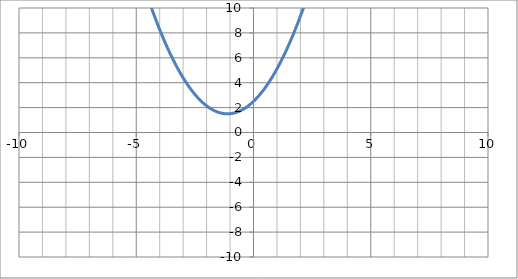
| Category | f(x) |
|---|---|
| -10.0 | 65.5 |
| -9.9 | 64.068 |
| -9.8 | 62.652 |
| -9.700000000000001 | 61.253 |
| -9.600000000000001 | 59.87 |
| -9.500000000000002 | 58.503 |
| -9.400000000000002 | 57.152 |
| -9.300000000000002 | 55.817 |
| -9.200000000000003 | 54.498 |
| -9.100000000000003 | 53.196 |
| -9.000000000000004 | 51.91 |
| -8.900000000000004 | 50.64 |
| -8.800000000000004 | 49.386 |
| -8.700000000000005 | 48.149 |
| -8.600000000000005 | 46.928 |
| -8.500000000000005 | 45.723 |
| -8.400000000000006 | 44.534 |
| -8.300000000000006 | 43.361 |
| -8.200000000000006 | 42.204 |
| -8.100000000000007 | 41.064 |
| -8.000000000000007 | 39.94 |
| -7.9000000000000075 | 38.832 |
| -7.800000000000008 | 37.74 |
| -7.700000000000008 | 36.665 |
| -7.6000000000000085 | 35.606 |
| -7.500000000000009 | 34.563 |
| -7.400000000000009 | 33.536 |
| -7.30000000000001 | 32.525 |
| -7.20000000000001 | 31.53 |
| -7.10000000000001 | 30.552 |
| -7.000000000000011 | 29.59 |
| -6.900000000000011 | 28.644 |
| -6.800000000000011 | 27.714 |
| -6.700000000000012 | 26.801 |
| -6.600000000000012 | 25.904 |
| -6.500000000000012 | 25.023 |
| -6.400000000000013 | 24.158 |
| -6.300000000000013 | 23.309 |
| -6.2000000000000135 | 22.476 |
| -6.100000000000014 | 21.66 |
| -6.000000000000014 | 20.86 |
| -5.900000000000015 | 20.076 |
| -5.800000000000015 | 19.308 |
| -5.700000000000015 | 18.557 |
| -5.600000000000016 | 17.822 |
| -5.500000000000016 | 17.103 |
| -5.400000000000016 | 16.4 |
| -5.300000000000017 | 15.713 |
| -5.200000000000017 | 15.042 |
| -5.100000000000017 | 14.388 |
| -5.000000000000018 | 13.75 |
| -4.900000000000018 | 13.128 |
| -4.8000000000000185 | 12.522 |
| -4.700000000000019 | 11.933 |
| -4.600000000000019 | 11.36 |
| -4.5000000000000195 | 10.803 |
| -4.40000000000002 | 10.262 |
| -4.30000000000002 | 9.737 |
| -4.200000000000021 | 9.228 |
| -4.100000000000021 | 8.736 |
| -4.000000000000021 | 8.26 |
| -3.9000000000000212 | 7.8 |
| -3.800000000000021 | 7.356 |
| -3.700000000000021 | 6.929 |
| -3.600000000000021 | 6.518 |
| -3.500000000000021 | 6.123 |
| -3.400000000000021 | 5.744 |
| -3.3000000000000207 | 5.381 |
| -3.2000000000000206 | 5.034 |
| -3.1000000000000205 | 4.704 |
| -3.0000000000000204 | 4.39 |
| -2.9000000000000203 | 4.092 |
| -2.8000000000000203 | 3.81 |
| -2.70000000000002 | 3.545 |
| -2.60000000000002 | 3.296 |
| -2.50000000000002 | 3.063 |
| -2.40000000000002 | 2.846 |
| -2.30000000000002 | 2.645 |
| -2.2000000000000197 | 2.46 |
| -2.1000000000000196 | 2.292 |
| -2.0000000000000195 | 2.14 |
| -1.9000000000000195 | 2.004 |
| -1.8000000000000194 | 1.884 |
| -1.7000000000000193 | 1.781 |
| -1.6000000000000192 | 1.694 |
| -1.500000000000019 | 1.623 |
| -1.400000000000019 | 1.568 |
| -1.300000000000019 | 1.529 |
| -1.2000000000000188 | 1.506 |
| -1.1000000000000187 | 1.5 |
| -1.0000000000000187 | 1.51 |
| -0.9000000000000187 | 1.536 |
| -0.8000000000000187 | 1.578 |
| -0.7000000000000187 | 1.637 |
| -0.6000000000000187 | 1.712 |
| -0.5000000000000188 | 1.802 |
| -0.4000000000000188 | 1.91 |
| -0.3000000000000188 | 2.033 |
| -0.2000000000000188 | 2.172 |
| -0.1000000000000188 | 2.328 |
| -1.8790524691780774e-14 | 2.5 |
| 0.09999999999998122 | 2.688 |
| 0.19999999999998122 | 2.892 |
| 0.2999999999999812 | 3.113 |
| 0.39999999999998126 | 3.35 |
| 0.49999999999998124 | 3.602 |
| 0.5999999999999812 | 3.872 |
| 0.6999999999999812 | 4.157 |
| 0.7999999999999812 | 4.458 |
| 0.8999999999999811 | 4.776 |
| 0.9999999999999811 | 5.11 |
| 1.0999999999999812 | 5.46 |
| 1.1999999999999813 | 5.826 |
| 1.2999999999999814 | 6.209 |
| 1.3999999999999815 | 6.608 |
| 1.4999999999999816 | 7.022 |
| 1.5999999999999817 | 7.454 |
| 1.6999999999999817 | 7.901 |
| 1.7999999999999818 | 8.364 |
| 1.899999999999982 | 8.844 |
| 1.999999999999982 | 9.34 |
| 2.099999999999982 | 9.852 |
| 2.199999999999982 | 10.38 |
| 2.299999999999982 | 10.925 |
| 2.399999999999982 | 11.486 |
| 2.4999999999999822 | 12.062 |
| 2.5999999999999823 | 12.656 |
| 2.6999999999999824 | 13.265 |
| 2.7999999999999825 | 13.89 |
| 2.8999999999999826 | 14.532 |
| 2.9999999999999827 | 15.19 |
| 3.0999999999999828 | 15.864 |
| 3.199999999999983 | 16.554 |
| 3.299999999999983 | 17.261 |
| 3.399999999999983 | 17.984 |
| 3.499999999999983 | 18.722 |
| 3.599999999999983 | 19.478 |
| 3.6999999999999833 | 20.249 |
| 3.7999999999999834 | 21.036 |
| 3.8999999999999835 | 21.84 |
| 3.9999999999999836 | 22.66 |
| 4.099999999999984 | 23.496 |
| 4.199999999999983 | 24.348 |
| 4.299999999999983 | 25.217 |
| 4.399999999999983 | 26.102 |
| 4.499999999999982 | 27.002 |
| 4.599999999999982 | 27.92 |
| 4.6999999999999815 | 28.853 |
| 4.799999999999981 | 29.802 |
| 4.899999999999981 | 30.768 |
| 4.9999999999999805 | 31.75 |
| 5.09999999999998 | 32.748 |
| 5.19999999999998 | 33.762 |
| 5.299999999999979 | 34.793 |
| 5.399999999999979 | 35.84 |
| 5.499999999999979 | 36.902 |
| 5.599999999999978 | 37.982 |
| 5.699999999999978 | 39.077 |
| 5.799999999999978 | 40.188 |
| 5.899999999999977 | 41.316 |
| 5.999999999999977 | 42.46 |
| 6.0999999999999766 | 43.62 |
| 6.199999999999976 | 44.796 |
| 6.299999999999976 | 45.989 |
| 6.3999999999999755 | 47.198 |
| 6.499999999999975 | 48.422 |
| 6.599999999999975 | 49.664 |
| 6.699999999999974 | 50.921 |
| 6.799999999999974 | 52.194 |
| 6.899999999999974 | 53.484 |
| 6.999999999999973 | 54.79 |
| 7.099999999999973 | 56.112 |
| 7.199999999999973 | 57.45 |
| 7.299999999999972 | 58.805 |
| 7.399999999999972 | 60.176 |
| 7.499999999999972 | 61.562 |
| 7.599999999999971 | 62.966 |
| 7.699999999999971 | 64.385 |
| 7.7999999999999705 | 65.82 |
| 7.89999999999997 | 67.272 |
| 7.99999999999997 | 68.74 |
| 8.09999999999997 | 70.224 |
| 8.199999999999969 | 71.724 |
| 8.299999999999969 | 73.241 |
| 8.399999999999968 | 74.774 |
| 8.499999999999968 | 76.322 |
| 8.599999999999968 | 77.888 |
| 8.699999999999967 | 79.469 |
| 8.799999999999967 | 81.066 |
| 8.899999999999967 | 82.68 |
| 8.999999999999966 | 84.31 |
| 9.099999999999966 | 85.956 |
| 9.199999999999966 | 87.618 |
| 9.299999999999965 | 89.297 |
| 9.399999999999965 | 90.992 |
| 9.499999999999964 | 92.702 |
| 9.599999999999964 | 94.43 |
| 9.699999999999964 | 96.173 |
| 9.799999999999963 | 97.932 |
| 9.899999999999963 | 99.708 |
| 9.999999999999963 | 101.5 |